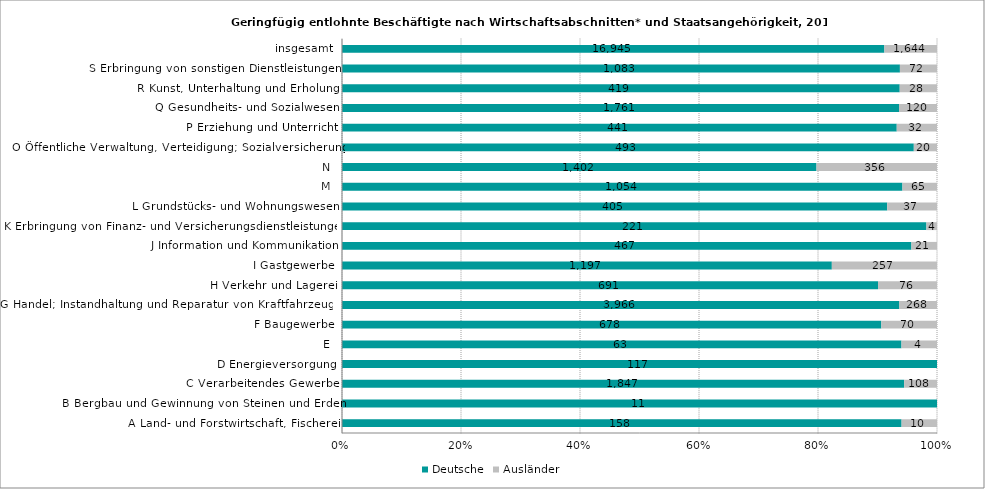
| Category | Deutsche | Ausländer |
|---|---|---|
| A Land- und Forstwirtschaft, Fischerei | 158 | 10 |
| B Bergbau und Gewinnung von Steinen und Erden | 11 | 0 |
| C Verarbeitendes Gewerbe | 1847 | 108 |
| D Energieversorgung | 117 | 0 |
| E | 63 | 4 |
| F Baugewerbe | 678 | 70 |
| G Handel; Instandhaltung und Reparatur von Kraftfahrzeugen | 3966 | 268 |
| H Verkehr und Lagerei | 691 | 76 |
| I Gastgewerbe | 1197 | 257 |
| J Information und Kommunikation | 467 | 21 |
| K Erbringung von Finanz- und Versicherungsdienstleistungen | 221 | 4 |
| L Grundstücks- und Wohnungswesen | 405 | 37 |
| M | 1054 | 65 |
| N | 1402 | 356 |
| O Öffentliche Verwaltung, Verteidigung; Sozialversicherung | 493 | 20 |
| P Erziehung und Unterricht | 441 | 32 |
| Q Gesundheits- und Sozialwesen | 1761 | 120 |
| R Kunst, Unterhaltung und Erholung | 419 | 28 |
| S Erbringung von sonstigen Dienstleistungen | 1083 | 72 |
| insgesamt | 16945 | 1644 |